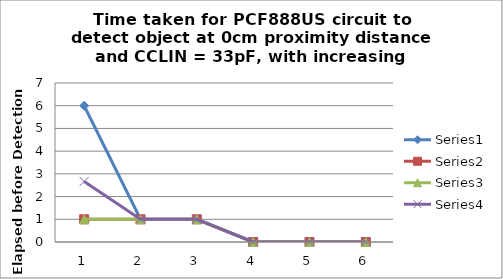
| Category | Series 0 | Series 1 | Series 2 | Series 3 |
|---|---|---|---|---|
| 0 | 6 | 1 | 1 | 2.667 |
| 1 | 1 | 1 | 1 | 1 |
| 2 | 1 | 1 | 1 | 1 |
| 3 | 0 | 0 | 0 | 0 |
| 4 | 0 | 0 | 0 | 0 |
| 5 | 0 | 0 | 0 | 0 |